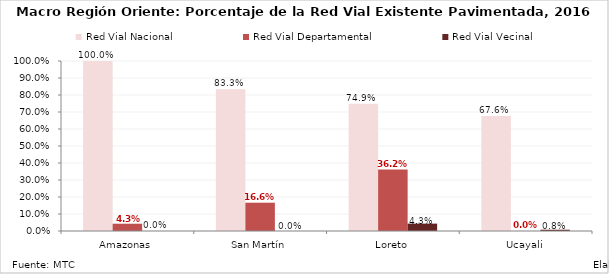
| Category | Red Vial Nacional | Red Vial Departamental | Red Vial Vecinal |
|---|---|---|---|
| Amazonas | 1 | 0.043 | 0 |
| San Martín | 0.833 | 0.166 | 0 |
| Loreto | 0.749 | 0.362 | 0.043 |
| Ucayali | 0.676 | 0 | 0.008 |